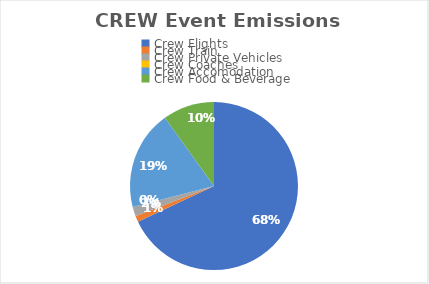
| Category | Series 0 |
|---|---|
| Crew Flights | 8.9 |
| Crew Train | 0.157 |
| Crew Private Vehicles | 0.23 |
| Crew Coaches | 0 |
| Crew Accomodation | 2.5 |
| Crew Food & Beverage | 1.3 |